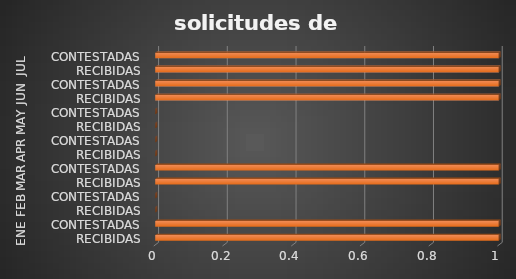
| Category | Series 0 |
|---|---|
| 0 | 1 |
| 1 | 1 |
| 2 | 0 |
| 3 | 0 |
| 4 | 1 |
| 5 | 1 |
| 6 | 0 |
| 7 | 0 |
| 8 | 0 |
| 9 | 0 |
| 10 | 1 |
| 11 | 1 |
| 12 | 1 |
| 13 | 1 |